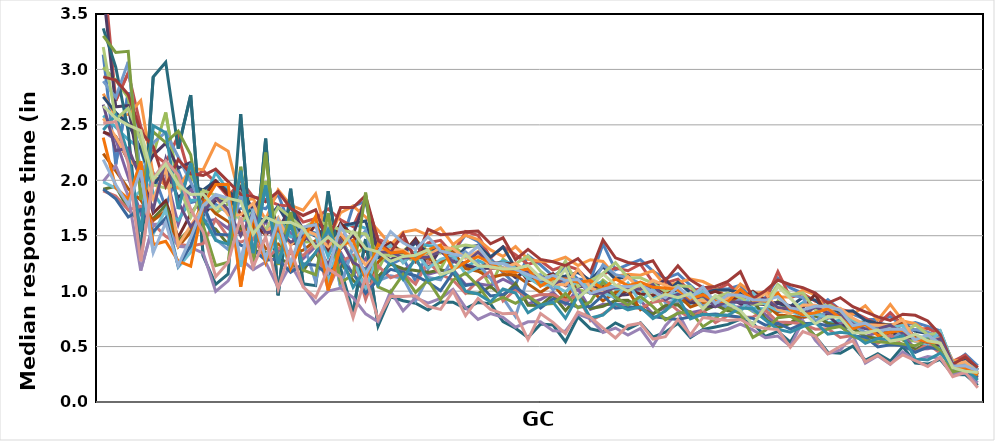
| Category | MAR | ALB | BRN | CAN | CHL | COL | CRI | ESP | GBR | GRC | HKG | HRV | IDN | ISR | KAZ | KOR | LTU | LVA | MLT | PAN | PHL | RUS | SGP | SRB | SVK | TAP | THA |
|---|---|---|---|---|---|---|---|---|---|---|---|---|---|---|---|---|---|---|---|---|---|---|---|---|---|---|---|
| CG123Q04T | 3.134 | 3.924 | 3.018 | 2.438 | 2.583 | 2.781 | 2.753 | 2.435 | 1.92 | 3.707 | 3.37 | 2.241 | 2.895 | 1.904 | 3.203 | 1.989 | 1.986 | 2.559 | 1.92 | 2.933 | 3.303 | 2.682 | 2.453 | 2.385 | 2.186 | 2.515 | 2.67 |
| CG135Q04T | 2.143 | 2.718 | 2.903 | 2.369 | 2.479 | 2.576 | 2.611 | 2.395 | 1.947 | 2.662 | 3.022 | 2.085 | 2.747 | 1.857 | 2.553 | 2.13 | 1.929 | 2.392 | 1.833 | 2.904 | 3.154 | 2.267 | 2.589 | 1.934 | 1.96 | 2.529 | 2.56 |
| CG128Q02T | 2.792 | 2.969 | 2.746 | 2.029 | 2.367 | 2.594 | 2.509 | 2.178 | 1.74 | 2.673 | 2.442 | 1.924 | 3.068 | 1.735 | 2.649 | 1.861 | 1.815 | 2.19 | 1.669 | 2.773 | 3.163 | 2.292 | 2.234 | 1.83 | 1.777 | 2.15 | 2.498 |
| CG126Q04T | 2.377 | 2.484 | 2.076 | 1.705 | 2.285 | 2.719 | 2.285 | 2.147 | 1.612 | 2.013 | 1.309 | 1.822 | 2.016 | 1.766 | 2.36 | 1.185 | 1.902 | 2.093 | 1.736 | 2.441 | 1.825 | 2.016 | 1.537 | 2.171 | 2.091 | 1.27 | 2.448 |
| CG133Q03T | 2.065 | 2.234 | 2.231 | 2.054 | 1.886 | 2.045 | 1.957 | 1.705 | 1.656 | 2.227 | 2.932 | 1.636 | 2.339 | 1.605 | 1.958 | 1.603 | 1.515 | 1.83 | 1.536 | 2.302 | 2.437 | 1.736 | 2.492 | 1.418 | 1.346 | 2.013 | 2.007 |
| CG123Q01T | 1.753 | 2.155 | 2.612 | 2.051 | 1.72 | 1.955 | 2.094 | 1.816 | 1.775 | 2.335 | 3.065 | 1.726 | 2.432 | 1.495 | 1.932 | 1.61 | 1.735 | 2.109 | 1.659 | 1.948 | 2.34 | 2.191 | 2.43 | 1.451 | 1.619 | 2.178 | 2.147 |
| CG129Q04T | 2.095 | 2.403 | 1.946 | 1.601 | 1.638 | 1.93 | 1.844 | 1.484 | 1.455 | 2.11 | 2.285 | 1.401 | 2.21 | 1.424 | 1.979 | 1.404 | 1.216 | 1.414 | 1.227 | 2.187 | 2.443 | 1.808 | 1.74 | 1.271 | 1.231 | 2.047 | 1.964 |
| CG132Q02T | 1.798 | 2.003 | 2.048 | 1.942 | 1.819 | 2.108 | 1.949 | 1.698 | 1.564 | 2.162 | 2.767 | 1.531 | 1.985 | 1.408 | 1.666 | 1.395 | 1.35 | 1.591 | 1.409 | 2.059 | 2.23 | 1.581 | 2.156 | 1.224 | 1.483 | 1.74 | 1.871 |
| CG134Q05T | 1.83 | 2.088 | 1.841 | 1.629 | 1.819 | 2.096 | 1.912 | 1.85 | 1.619 | 1.682 | 1.315 | 1.823 | 1.765 | 1.428 | 1.908 | 1.344 | 1.757 | 1.766 | 1.782 | 2.043 | 1.592 | 1.712 | 1.662 | 1.78 | 1.772 | 1.534 | 1.875 |
| CG128Q01T | 1.783 | 1.981 | 1.702 | 1.645 | 2.068 | 2.33 | 1.996 | 1.992 | 1.56 | 1.817 | 1.062 | 1.7 | 1.468 | 1.648 | 1.865 | 0.998 | 1.762 | 1.849 | 1.514 | 2.1 | 1.229 | 1.851 | 1.457 | 1.963 | 1.872 | 1.13 | 1.738 |
| CG131Q05T | 1.707 | 1.85 | 1.79 | 1.564 | 1.906 | 2.262 | 1.895 | 1.871 | 1.419 | 1.811 | 1.155 | 1.628 | 1.375 | 1.488 | 1.813 | 1.093 | 1.723 | 1.687 | 1.506 | 1.988 | 1.262 | 1.735 | 1.424 | 1.964 | 1.839 | 1.261 | 1.838 |
| CG134Q01T | 1.744 | 1.997 | 1.946 | 1.867 | 1.628 | 1.812 | 1.832 | 1.698 | 1.579 | 1.941 | 2.597 | 1.53 | 1.881 | 1.442 | 1.631 | 1.291 | 1.219 | 1.688 | 1.415 | 1.873 | 2.123 | 1.499 | 2.085 | 1.04 | 1.282 | 1.668 | 1.81 |
| CG125Q04T | 1.774 | 1.85 | 1.483 | 1.337 | 1.672 | 1.833 | 1.686 | 1.606 | 1.365 | 1.728 | 1.191 | 1.587 | 1.454 | 1.484 | 1.717 | 1.194 | 1.743 | 1.794 | 1.375 | 1.854 | 1.248 | 1.708 | 1.343 | 1.685 | 1.707 | 1.217 | 1.514 |
| CG126Q03T | 1.744 | 1.826 | 1.991 | 1.644 | 1.525 | 1.646 | 1.629 | 1.509 | 1.351 | 1.923 | 2.375 | 1.381 | 1.922 | 1.287 | 1.555 | 1.262 | 1.265 | 1.514 | 1.28 | 1.806 | 2.25 | 1.525 | 1.953 | 1.26 | 1.294 | 1.49 | 1.666 |
| CG128Q05T | 1.874 | 1.778 | 1.545 | 1.356 | 1.651 | 1.914 | 1.766 | 1.6 | 1.296 | 1.549 | 0.963 | 1.426 | 1.502 | 1.39 | 1.757 | 1.033 | 1.508 | 1.663 | 1.289 | 1.899 | 1.236 | 1.547 | 1.25 | 1.604 | 1.638 | 1.021 | 1.618 |
| CG122Q01T | 1.57 | 1.766 | 1.669 | 1.522 | 1.49 | 1.774 | 1.568 | 1.424 | 1.248 | 1.761 | 1.924 | 1.338 | 1.628 | 1.343 | 1.665 | 1.242 | 1.206 | 1.413 | 1.171 | 1.748 | 1.714 | 1.441 | 1.606 | 1.204 | 1.25 | 1.383 | 1.62 |
| CG129Q02T | 1.559 | 1.623 | 1.443 | 1.293 | 1.521 | 1.731 | 1.537 | 1.449 | 1.184 | 1.553 | 1.066 | 1.369 | 1.444 | 1.321 | 1.566 | 1.046 | 1.522 | 1.556 | 1.246 | 1.683 | 1.189 | 1.497 | 1.221 | 1.466 | 1.578 | 1.036 | 1.568 |
| CG127Q01T | 1.523 | 1.655 | 1.446 | 1.404 | 1.636 | 1.878 | 1.638 | 1.6 | 1.348 | 1.495 | 1.049 | 1.457 | 1.083 | 1.43 | 1.637 | 0.89 | 1.512 | 1.51 | 1.234 | 1.733 | 1.149 | 1.422 | 1.347 | 1.676 | 1.599 | 0.941 | 1.394 |
| CG139Q05T | 1.45 | 1.742 | 1.565 | 1.456 | 1.309 | 1.458 | 1.507 | 1.375 | 1.15 | 1.591 | 1.902 | 1.23 | 1.585 | 1.018 | 1.596 | 1.001 | 1.101 | 1.402 | 1.152 | 1.447 | 1.705 | 1.238 | 1.551 | 1.006 | 1.175 | 1.202 | 1.488 |
| CG121Q02T | 1.407 | 1.643 | 1.433 | 1.352 | 1.57 | 1.707 | 1.588 | 1.613 | 1.256 | 1.384 | 1.206 | 1.495 | 1.034 | 1.268 | 1.552 | 1.027 | 1.46 | 1.522 | 1.279 | 1.755 | 1.077 | 1.463 | 1.329 | 1.408 | 1.585 | 1.128 | 1.392 |
| CG131Q02T | 1.768 | 1.582 | 1.31 | 1.146 | 1.607 | 1.766 | 1.611 | 1.498 | 1.097 | 1.508 | 0.805 | 1.251 | 1.411 | 1.323 | 1.529 | 0.942 | 1.291 | 1.38 | 1.162 | 1.755 | 1.148 | 1.259 | 1.034 | 1.46 | 1.395 | 0.76 | 1.536 |
| CG138Q01T | 1.809 | 1.83 | 1.403 | 1.294 | 1.566 | 1.669 | 1.633 | 1.359 | 1.004 | 1.828 | 1.47 | 1.039 | 1.546 | 0.924 | 1.516 | 0.795 | 1.013 | 1.236 | 0.981 | 1.862 | 1.889 | 1.197 | 1.196 | 1.104 | 1.155 | 1.128 | 1.385 |
| CG139Q02T | 1.328 | 1.468 | 1.192 | 1.106 | 1.419 | 1.548 | 1.301 | 1.374 | 1.132 | 1.341 | 0.686 | 1.261 | 1.094 | 1.227 | 1.339 | 0.724 | 1.344 | 1.357 | 1.104 | 1.455 | 1.038 | 1.346 | 1.056 | 1.422 | 1.35 | 0.746 | 1.354 |
| CG139Q01T | 1.24 | 1.427 | 1.424 | 1.258 | 1.372 | 1.419 | 1.331 | 1.437 | 1.244 | 1.284 | 0.948 | 1.38 | 1.137 | 1.12 | 1.319 | 0.997 | 1.413 | 1.378 | 1.197 | 1.35 | 0.989 | 1.357 | 1.272 | 1.344 | 1.538 | 0.953 | 1.268 |
| CG122Q04T | 1.298 | 1.464 | 1.356 | 1.175 | 1.328 | 1.532 | 1.355 | 1.333 | 1.203 | 1.34 | 0.913 | 1.26 | 1.117 | 1.16 | 1.325 | 0.823 | 1.256 | 1.37 | 1.169 | 1.516 | 1.151 | 1.301 | 1.106 | 1.356 | 1.436 | 0.952 | 1.313 |
| CG125Q01T | 1.089 | 1.315 | 1.466 | 1.278 | 1.434 | 1.554 | 1.436 | 1.475 | 1.185 | 1.454 | 0.891 | 1.355 | 0.91 | 1.064 | 1.261 | 0.94 | 1.355 | 1.299 | 1.139 | 1.276 | 0.989 | 1.301 | 1.303 | 1.283 | 1.378 | 0.958 | 1.324 |
| CG138Q02T | 1.365 | 1.435 | 1.357 | 1.152 | 1.412 | 1.503 | 1.352 | 1.28 | 1.168 | 1.204 | 0.83 | 1.289 | 1.125 | 1.267 | 1.358 | 0.891 | 1.206 | 1.315 | 1.08 | 1.558 | 1.099 | 1.308 | 1.095 | 1.374 | 1.491 | 0.862 | 1.373 |
| CG138Q03T | 1.4 | 1.458 | 1.201 | 1.183 | 1.4 | 1.57 | 1.404 | 1.361 | 1.192 | 1.381 | 0.903 | 1.259 | 1.102 | 1.152 | 1.343 | 0.935 | 1.286 | 1.398 | 1.004 | 1.509 | 0.925 | 1.36 | 1.129 | 1.417 | 1.362 | 0.835 | 1.149 |
| CG122Q03T | 1.352 | 1.334 | 1.408 | 1.195 | 1.217 | 1.422 | 1.266 | 1.273 | 1.168 | 1.311 | 0.901 | 1.358 | 1.3 | 1.099 | 1.394 | 1.016 | 1.326 | 1.384 | 1.17 | 1.519 | 1.1 | 1.266 | 1.198 | 1.193 | 1.336 | 1 | 1.188 |
| CG124Q03T | 1.507 | 1.538 | 1.322 | 1.061 | 1.22 | 1.504 | 1.395 | 1.226 | 0.986 | 1.237 | 0.842 | 1.203 | 1.356 | 0.981 | 1.417 | 0.852 | 1.155 | 1.297 | 1.05 | 1.536 | 1.163 | 1.253 | 1 | 1.262 | 1.312 | 0.779 | 1.33 |
| CG133Q02T | 1.448 | 1.504 | 1.241 | 1.066 | 1.276 | 1.465 | 1.411 | 1.211 | 0.979 | 1.205 | 0.899 | 1.179 | 1.246 | 1.095 | 1.399 | 0.746 | 1.215 | 1.358 | 1.074 | 1.542 | 1.049 | 1.352 | 0.975 | 1.311 | 1.405 | 0.935 | 1.229 |
| CG136Q01T | 1.294 | 1.301 | 1.041 | 1.048 | 1.225 | 1.372 | 1.309 | 1.255 | 1.042 | 1.207 | 0.885 | 1.122 | 1.114 | 1.183 | 1.263 | 0.797 | 1.236 | 1.212 | 0.956 | 1.427 | 0.894 | 1.249 | 0.903 | 1.256 | 1.256 | 0.836 | 1.22 |
| CG135Q01T | 1.168 | 1.401 | 1.29 | 1.107 | 1.274 | 1.314 | 1.398 | 1.252 | 0.954 | 1.209 | 0.725 | 1.15 | 0.939 | 0.911 | 1.202 | 0.763 | 1.254 | 1.199 | 0.97 | 1.481 | 0.943 | 1.183 | 1.019 | 1.182 | 1.245 | 0.795 | 1.199 |
| CG130Q01T | 1.059 | 1.328 | 1.206 | 1.052 | 1.239 | 1.402 | 1.209 | 1.243 | 1.069 | 1.122 | 0.665 | 1.145 | 0.771 | 1.016 | 1.246 | 0.675 | 1.211 | 1.251 | 1.037 | 1.283 | 0.89 | 1.193 | 0.983 | 1.169 | 1.197 | 0.802 | 1.202 |
| CG137Q01T | 1.322 | 1.242 | 1.127 | 0.885 | 1.142 | 1.286 | 1.163 | 1.093 | 0.873 | 1.193 | 0.582 | 1.066 | 1.13 | 0.942 | 1.316 | 0.723 | 1.118 | 1.171 | 0.954 | 1.376 | 0.955 | 1.17 | 0.805 | 1.204 | 1.149 | 0.564 | 1.231 |
| CG132Q01T | 1.237 | 1.274 | 1.047 | 0.924 | 1.075 | 1.271 | 1.132 | 1.117 | 0.87 | 1.102 | 0.703 | 0.989 | 1.148 | 0.969 | 1.179 | 0.724 | 1.056 | 1.125 | 0.847 | 1.287 | 0.879 | 1.106 | 0.873 | 1.045 | 1.104 | 0.798 | 1.121 |
| CG126Q01T | 1.135 | 1.191 | 1.099 | 0.988 | 1.154 | 1.267 | 1.123 | 1.156 | 0.966 | 1.13 | 0.694 | 1.063 | 1.013 | 0.968 | 1.091 | 0.644 | 1.059 | 1.069 | 0.93 | 1.265 | 0.887 | 1.061 | 0.901 | 1.114 | 1.143 | 0.718 | 1.059 |
| CG130Q05T | 1.21 | 1.233 | 1.087 | 0.88 | 1.11 | 1.306 | 1.136 | 1.052 | 0.824 | 1.047 | 0.545 | 0.928 | 1.091 | 0.919 | 1.271 | 0.639 | 0.993 | 1.055 | 0.893 | 1.23 | 0.978 | 1.117 | 0.754 | 1.109 | 1.098 | 0.618 | 1.199 |
| CG122Q02T | 1.109 | 1.194 | 1.015 | 1.02 | 1.079 | 1.232 | 1.169 | 1.102 | 0.959 | 1.044 | 0.769 | 1.096 | 0.94 | 0.958 | 1.042 | 0.792 | 1.097 | 1.199 | 0.856 | 1.294 | 0.849 | 1.092 | 0.959 | 1.08 | 1.104 | 0.813 | 0.936 |
| CG122Q05T | 1.098 | 1.076 | 0.983 | 0.836 | 1.053 | 1.283 | 1.097 | 1.02 | 0.843 | 1.04 | 0.661 | 1.01 | 1.031 | 0.734 | 1.096 | 0.75 | 1.024 | 1.031 | 0.861 | 1.17 | 0.903 | 0.979 | 0.757 | 1.095 | 0.978 | 0.764 | 1.036 |
| CG124Q02T | 1.426 | 1.151 | 1.099 | 0.881 | 1.085 | 1.268 | 1.22 | 1.044 | 0.864 | 0.998 | 0.634 | 0.913 | 1.238 | 0.793 | 1.159 | 0.627 | 0.987 | 0.985 | 0.965 | 1.463 | 1.082 | 0.98 | 0.785 | 1.021 | 1.017 | 0.669 | 1.157 |
| CG127Q03T | 1.192 | 1.208 | 1.015 | 0.88 | 1.018 | 1.135 | 1.107 | 0.929 | 0.915 | 0.961 | 0.714 | 0.988 | 1.149 | 0.87 | 1.258 | 0.667 | 0.938 | 1.037 | 0.846 | 1.301 | 0.946 | 1.036 | 0.888 | 1.111 | 1.045 | 0.578 | 1.056 |
| CG123Q02T | 1.239 | 1.184 | 1.041 | 0.889 | 1.007 | 1.153 | 1.136 | 1.01 | 0.917 | 0.969 | 0.657 | 1.007 | 1.122 | 0.858 | 1.121 | 0.604 | 1.073 | 1.13 | 0.858 | 1.258 | 0.875 | 1.029 | 0.831 | 1.05 | 1.039 | 0.691 | 1 |
| CG127Q02T | 1.284 | 1.243 | 1.03 | 0.914 | 1.009 | 1.144 | 1.04 | 0.975 | 0.846 | 1.044 | 0.713 | 0.834 | 1.068 | 0.847 | 1.121 | 0.663 | 0.897 | 1.009 | 0.848 | 1.238 | 0.952 | 1.018 | 0.858 | 1.082 | 1.052 | 0.711 | 1.063 |
| CG134Q04T | 1.18 | 1.079 | 0.993 | 0.796 | 0.943 | 1.184 | 1.055 | 0.962 | 0.793 | 1.02 | 0.586 | 0.908 | 1.043 | 0.9 | 1.07 | 0.506 | 1.023 | 1.098 | 0.77 | 1.274 | 0.86 | 1.059 | 0.752 | 1.035 | 0.995 | 0.568 | 0.918 |
| CG138Q04T | 1.112 | 1.075 | 0.824 | 0.854 | 0.952 | 1.048 | 0.984 | 1.027 | 0.871 | 1.109 | 0.629 | 0.984 | 0.895 | 0.919 | 0.998 | 0.688 | 0.948 | 1.053 | 0.754 | 1.095 | 0.741 | 0.924 | 0.823 | 1.028 | 0.941 | 0.59 | 0.972 |
| CG136Q03T | 1.158 | 1.109 | 0.906 | 0.882 | 0.922 | 1.078 | 1.081 | 0.946 | 0.877 | 0.981 | 0.711 | 0.965 | 0.913 | 0.825 | 1.049 | 0.808 | 0.984 | 1.009 | 0.745 | 1.228 | 0.801 | 0.973 | 0.945 | 1.014 | 1.038 | 0.745 | 0.941 |
| CG132Q03T | 1.052 | 0.996 | 0.923 | 0.806 | 0.888 | 1.11 | 0.986 | 0.901 | 0.772 | 0.898 | 0.581 | 0.856 | 0.986 | 0.758 | 1.041 | 0.594 | 0.937 | 0.926 | 0.768 | 1.101 | 0.816 | 0.917 | 0.749 | 0.929 | 0.941 | 0.606 | 0.979 |
| CG127Q05T | 0.95 | 1.029 | 0.924 | 0.827 | 0.985 | 1.087 | 0.98 | 0.959 | 0.817 | 0.868 | 0.654 | 0.898 | 0.859 | 0.828 | 0.917 | 0.646 | 1.004 | 0.914 | 0.785 | 1.032 | 0.68 | 0.961 | 0.792 | 0.968 | 1.039 | 0.762 | 0.84 |
| CG127Q04T | 1.022 | 1.008 | 0.927 | 0.87 | 0.886 | 1.031 | 1.011 | 0.999 | 0.873 | 0.859 | 0.676 | 0.907 | 0.914 | 0.717 | 0.949 | 0.629 | 0.915 | 0.906 | 0.794 | 1.043 | 0.754 | 0.861 | 0.783 | 0.909 | 0.888 | 0.749 | 0.961 |
| CG123Q03T | 1.02 | 1.065 | 0.97 | 0.851 | 0.884 | 0.934 | 1.01 | 0.951 | 0.824 | 0.944 | 0.7 | 0.902 | 0.85 | 0.778 | 0.982 | 0.656 | 0.922 | 0.939 | 0.78 | 1.088 | 0.848 | 0.905 | 0.781 | 0.906 | 0.967 | 0.735 | 0.885 |
| CG125Q02T | 1.053 | 0.966 | 0.885 | 0.86 | 0.927 | 1.064 | 0.99 | 0.928 | 0.822 | 0.886 | 0.748 | 0.925 | 0.935 | 0.763 | 0.942 | 0.703 | 0.815 | 1.014 | 0.765 | 1.175 | 0.797 | 0.899 | 0.848 | 1.016 | 0.964 | 0.744 | 0.823 |
| CG128Q03T | 0.904 | 0.947 | 0.817 | 0.895 | 0.849 | 0.98 | 0.956 | 0.998 | 0.923 | 0.884 | 0.711 | 0.963 | 0.819 | 0.766 | 0.88 | 0.65 | 0.985 | 0.917 | 0.755 | 0.932 | 0.583 | 0.89 | 0.841 | 0.921 | 0.923 | 0.683 | 0.697 |
| CG130Q04T | 0.941 | 0.916 | 0.744 | 0.788 | 0.84 | 0.992 | 0.91 | 0.92 | 0.748 | 0.881 | 0.591 | 0.883 | 0.82 | 0.829 | 0.889 | 0.58 | 0.881 | 0.98 | 0.693 | 1.004 | 0.646 | 0.934 | 0.738 | 0.909 | 0.917 | 0.662 | 0.855 |
| CG121Q01T | 1.119 | 1.177 | 0.911 | 0.689 | 0.82 | 0.948 | 0.889 | 0.812 | 0.668 | 0.9 | 0.637 | 0.786 | 1.05 | 0.721 | 1.06 | 0.595 | 0.822 | 0.837 | 0.711 | 1.1 | 0.761 | 0.854 | 0.656 | 0.984 | 0.951 | 0.653 | 1.041 |
| CG124Q01T | 1.03 | 0.941 | 0.81 | 0.707 | 0.832 | 0.948 | 0.861 | 0.853 | 0.71 | 0.867 | 0.54 | 0.774 | 0.966 | 0.718 | 0.97 | 0.503 | 0.813 | 0.795 | 0.657 | 1.058 | 0.772 | 0.839 | 0.63 | 0.833 | 0.849 | 0.493 | 0.937 |
| CG135Q05T | 0.981 | 0.978 | 0.834 | 0.762 | 0.895 | 1.01 | 0.944 | 0.85 | 0.802 | 0.852 | 0.726 | 0.766 | 0.942 | 0.702 | 0.984 | 0.733 | 0.781 | 0.875 | 0.706 | 1.031 | 0.715 | 0.784 | 0.681 | 0.786 | 0.831 | 0.635 | 0.818 |
| CG131Q03T | 0.834 | 0.909 | 0.767 | 0.782 | 0.84 | 0.967 | 0.92 | 0.973 | 0.778 | 0.718 | 0.592 | 0.79 | 0.722 | 0.656 | 0.832 | 0.556 | 0.794 | 0.873 | 0.713 | 0.983 | 0.591 | 0.857 | 0.717 | 0.806 | 0.863 | 0.594 | 0.706 |
| CG134Q02T | 0.923 | 0.902 | 0.808 | 0.704 | 0.713 | 0.81 | 0.816 | 0.757 | 0.711 | 0.783 | 0.449 | 0.765 | 0.831 | 0.661 | 0.883 | 0.435 | 0.761 | 0.839 | 0.686 | 0.892 | 0.66 | 0.802 | 0.612 | 0.841 | 0.864 | 0.435 | 0.77 |
| CG137Q03T | 0.828 | 0.835 | 0.768 | 0.712 | 0.739 | 0.833 | 0.811 | 0.78 | 0.686 | 0.679 | 0.44 | 0.795 | 0.777 | 0.582 | 0.823 | 0.47 | 0.782 | 0.846 | 0.69 | 0.942 | 0.682 | 0.783 | 0.63 | 0.759 | 0.828 | 0.503 | 0.761 |
| CG139Q04T | 0.793 | 0.812 | 0.75 | 0.666 | 0.703 | 0.79 | 0.822 | 0.741 | 0.663 | 0.723 | 0.504 | 0.73 | 0.701 | 0.599 | 0.749 | 0.601 | 0.726 | 0.757 | 0.596 | 0.859 | 0.592 | 0.705 | 0.615 | 0.66 | 0.689 | 0.553 | 0.625 |
| CG136Q02T | 0.744 | 0.757 | 0.669 | 0.591 | 0.729 | 0.868 | 0.736 | 0.693 | 0.59 | 0.688 | 0.376 | 0.706 | 0.624 | 0.566 | 0.694 | 0.35 | 0.669 | 0.697 | 0.585 | 0.814 | 0.552 | 0.66 | 0.529 | 0.702 | 0.711 | 0.363 | 0.622 |
| CG137Q02T | 0.744 | 0.701 | 0.65 | 0.626 | 0.634 | 0.739 | 0.71 | 0.704 | 0.572 | 0.615 | 0.435 | 0.66 | 0.673 | 0.529 | 0.689 | 0.418 | 0.672 | 0.692 | 0.497 | 0.767 | 0.544 | 0.659 | 0.574 | 0.6 | 0.642 | 0.421 | 0.649 |
| CG129Q03aT | 0.771 | 0.806 | 0.696 | 0.59 | 0.694 | 0.88 | 0.692 | 0.694 | 0.644 | 0.637 | 0.368 | 0.608 | 0.559 | 0.604 | 0.695 | 0.34 | 0.673 | 0.686 | 0.516 | 0.737 | 0.534 | 0.693 | 0.56 | 0.632 | 0.656 | 0.344 | 0.55 |
| CG131Q04T | 0.684 | 0.693 | 0.557 | 0.605 | 0.633 | 0.732 | 0.702 | 0.708 | 0.567 | 0.583 | 0.499 | 0.709 | 0.638 | 0.511 | 0.622 | 0.452 | 0.69 | 0.742 | 0.509 | 0.792 | 0.523 | 0.618 | 0.597 | 0.648 | 0.656 | 0.425 | 0.568 |
| CG125Q03T | 0.717 | 0.649 | 0.551 | 0.478 | 0.602 | 0.706 | 0.638 | 0.58 | 0.468 | 0.575 | 0.352 | 0.556 | 0.654 | 0.451 | 0.696 | 0.375 | 0.547 | 0.551 | 0.449 | 0.782 | 0.508 | 0.575 | 0.389 | 0.574 | 0.562 | 0.373 | 0.611 |
| CG134Q03T | 0.682 | 0.664 | 0.584 | 0.48 | 0.567 | 0.625 | 0.618 | 0.556 | 0.54 | 0.501 | 0.342 | 0.547 | 0.63 | 0.524 | 0.608 | 0.41 | 0.522 | 0.537 | 0.496 | 0.731 | 0.557 | 0.535 | 0.38 | 0.542 | 0.604 | 0.321 | 0.553 |
| CG133Q04T | 0.64 | 0.607 | 0.636 | 0.508 | 0.497 | 0.593 | 0.587 | 0.564 | 0.519 | 0.515 | 0.384 | 0.547 | 0.579 | 0.44 | 0.62 | 0.394 | 0.64 | 0.577 | 0.47 | 0.609 | 0.464 | 0.571 | 0.441 | 0.531 | 0.526 | 0.404 | 0.532 |
| CG129Q03cT | 0.344 | 0.366 | 0.353 | 0.325 | 0.338 | 0.372 | 0.337 | 0.342 | 0.351 | 0.316 | 0.248 | 0.359 | 0.311 | 0.344 | 0.29 | 0.254 | 0.354 | 0.334 | 0.295 | 0.339 | 0.271 | 0.335 | 0.321 | 0.318 | 0.322 | 0.228 | 0.31 |
| CG129Q03bT | 0.431 | 0.422 | 0.345 | 0.306 | 0.358 | 0.377 | 0.377 | 0.328 | 0.293 | 0.32 | 0.247 | 0.342 | 0.34 | 0.326 | 0.307 | 0.26 | 0.352 | 0.363 | 0.276 | 0.406 | 0.299 | 0.294 | 0.309 | 0.308 | 0.326 | 0.268 | 0.278 |
| CG129Q03dT | 0.326 | 0.288 | 0.259 | 0.217 | 0.279 | 0.313 | 0.289 | 0.262 | 0.235 | 0.25 | 0.151 | 0.25 | 0.282 | 0.225 | 0.302 | 0.174 | 0.295 | 0.262 | 0.225 | 0.31 | 0.242 | 0.283 | 0.197 | 0.246 | 0.28 | 0.128 | 0.266 |